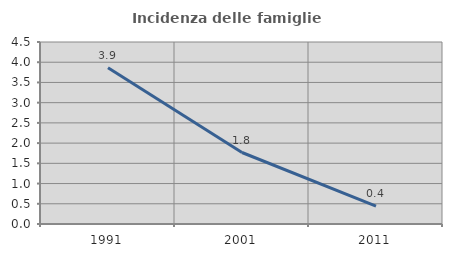
| Category | Incidenza delle famiglie numerose |
|---|---|
| 1991.0 | 3.862 |
| 2001.0 | 1.767 |
| 2011.0 | 0.44 |